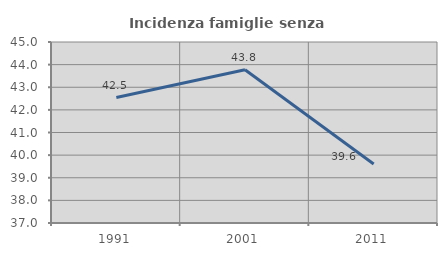
| Category | Incidenza famiglie senza nuclei |
|---|---|
| 1991.0 | 42.544 |
| 2001.0 | 43.775 |
| 2011.0 | 39.608 |